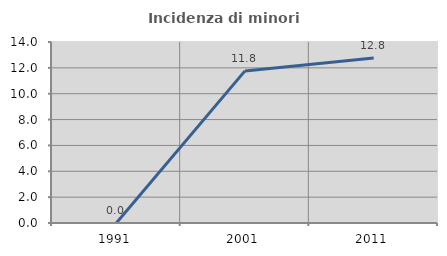
| Category | Incidenza di minori stranieri |
|---|---|
| 1991.0 | 0 |
| 2001.0 | 11.765 |
| 2011.0 | 12.766 |